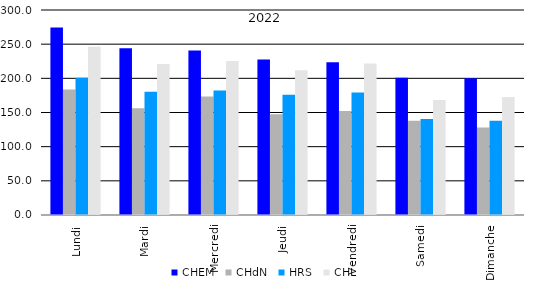
| Category | CHEM  | CHdN  | HRS  | CHL  |
|---|---|---|---|---|
| Lundi | 274.462 | 183.596 | 200.981 | 246.135 |
| Mardi | 243.846 | 156.173 | 180.442 | 221.154 |
| Mercredi | 240.558 | 173.577 | 182.154 | 225.308 |
| Jeudi | 227.577 | 147.423 | 175.923 | 211.923 |
| Vendredi | 223.692 | 152.25 | 179.442 | 221.692 |
| Samedi | 200.868 | 137.774 | 140.434 | 168.453 |
| Dimanche | 199.962 | 127.923 | 138.038 | 172.558 |